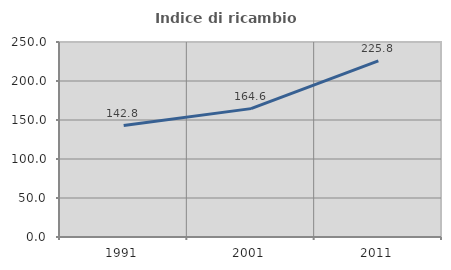
| Category | Indice di ricambio occupazionale  |
|---|---|
| 1991.0 | 142.823 |
| 2001.0 | 164.585 |
| 2011.0 | 225.757 |